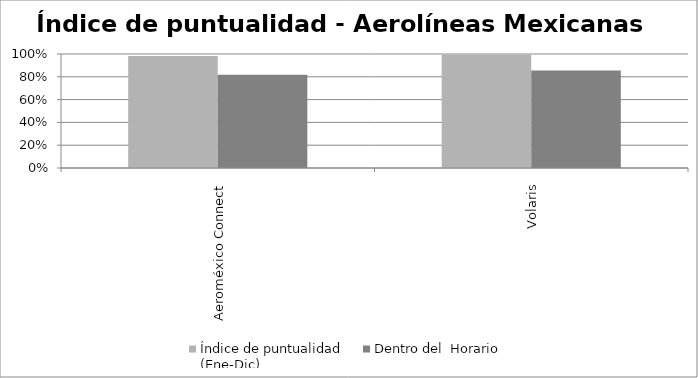
| Category | Índice de puntualidad
(Ene-Dic) | Dentro del  Horario |
|---|---|---|
| Aeroméxico Connect | 0.982 | 0.819 |
| Volaris | 0.996 | 0.856 |